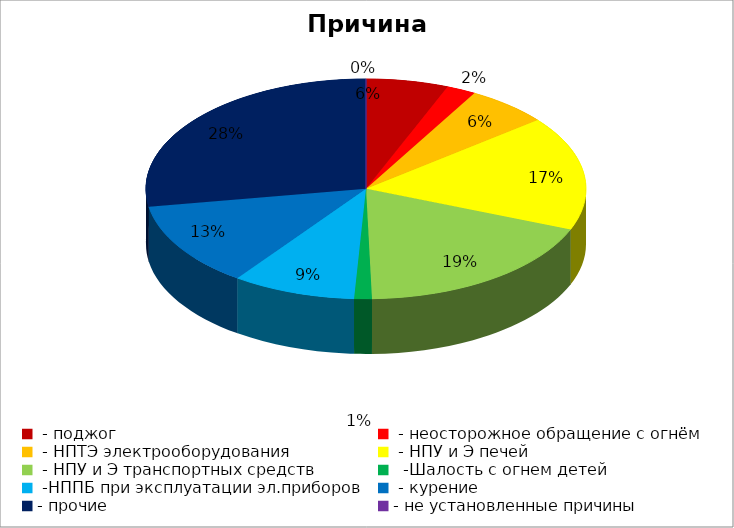
| Category | Причина пожара |
|---|---|
|  - поджог | 14 |
|  - неосторожное обращение с огнём | 5 |
|  - НПТЭ электрооборудования | 14 |
|  - НПУ и Э печей | 39 |
|  - НПУ и Э транспортных средств | 43 |
|   -Шалость с огнем детей | 3 |
|  -НППБ при эксплуатации эл.приборов | 21 |
|  - курение | 29 |
| - прочие | 64 |
| - не установленные причины | 0 |